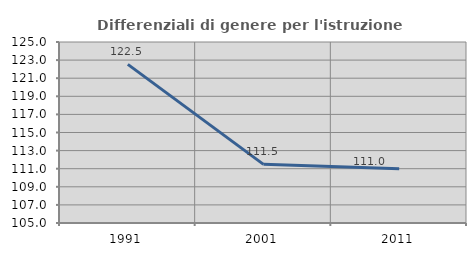
| Category | Differenziali di genere per l'istruzione superiore |
|---|---|
| 1991.0 | 122.531 |
| 2001.0 | 111.48 |
| 2011.0 | 111.006 |